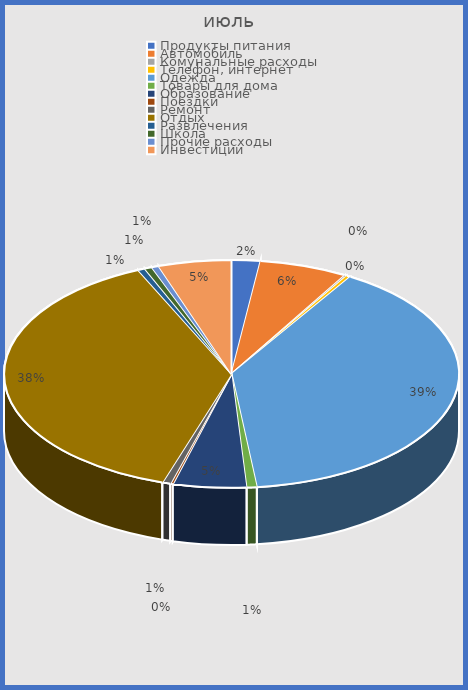
| Category | Series 0 |
|---|---|
| Продукты питания | 0.02 |
| Автомобиль | 0.063 |
| Комунальные расходы | 0.002 |
| Телефон, интернет | 0.003 |
| Одежда | 0.395 |
| Товары для дома | 0.007 |
| Образование | 0.052 |
| Поездки | 0.002 |
| Ремонт | 0.006 |
| Отдых | 0.384 |
| Развлечения | 0.005 |
| Школа | 0.005 |
| Прочие расходы | 0.005 |
| Инвестиции | 0.052 |